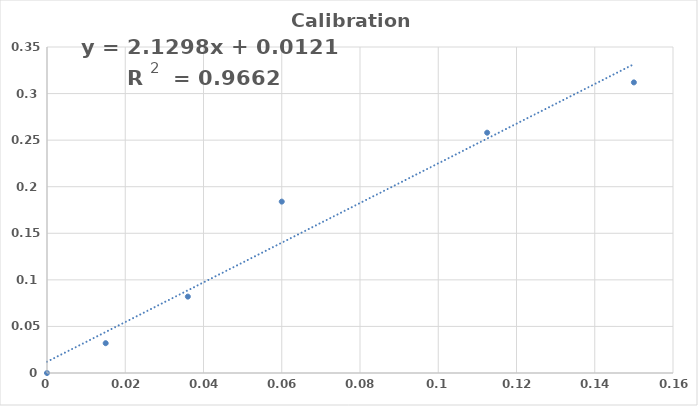
| Category | Series 0 |
|---|---|
| 0.0 | 0 |
| 0.015 | 0.032 |
| 0.036 | 0.082 |
| 0.06 | 0.184 |
| 0.1125 | 0.258 |
| 0.15 | 0.312 |